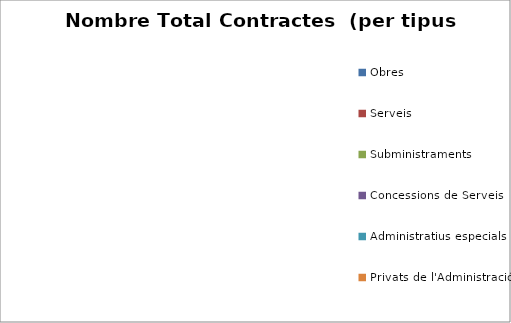
| Category | Nombre Total Contractes |
|---|---|
| Obres | 0 |
| Serveis | 0 |
| Subministraments | 0 |
| Concessions de Serveis | 0 |
| Administratius especials | 0 |
| Privats de l'Administració | 0 |